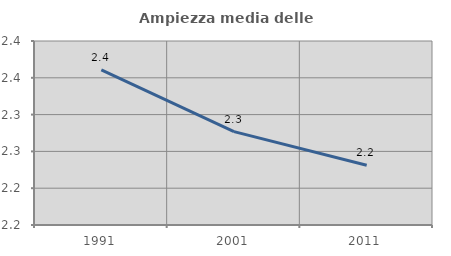
| Category | Ampiezza media delle famiglie |
|---|---|
| 1991.0 | 2.361 |
| 2001.0 | 2.277 |
| 2011.0 | 2.231 |